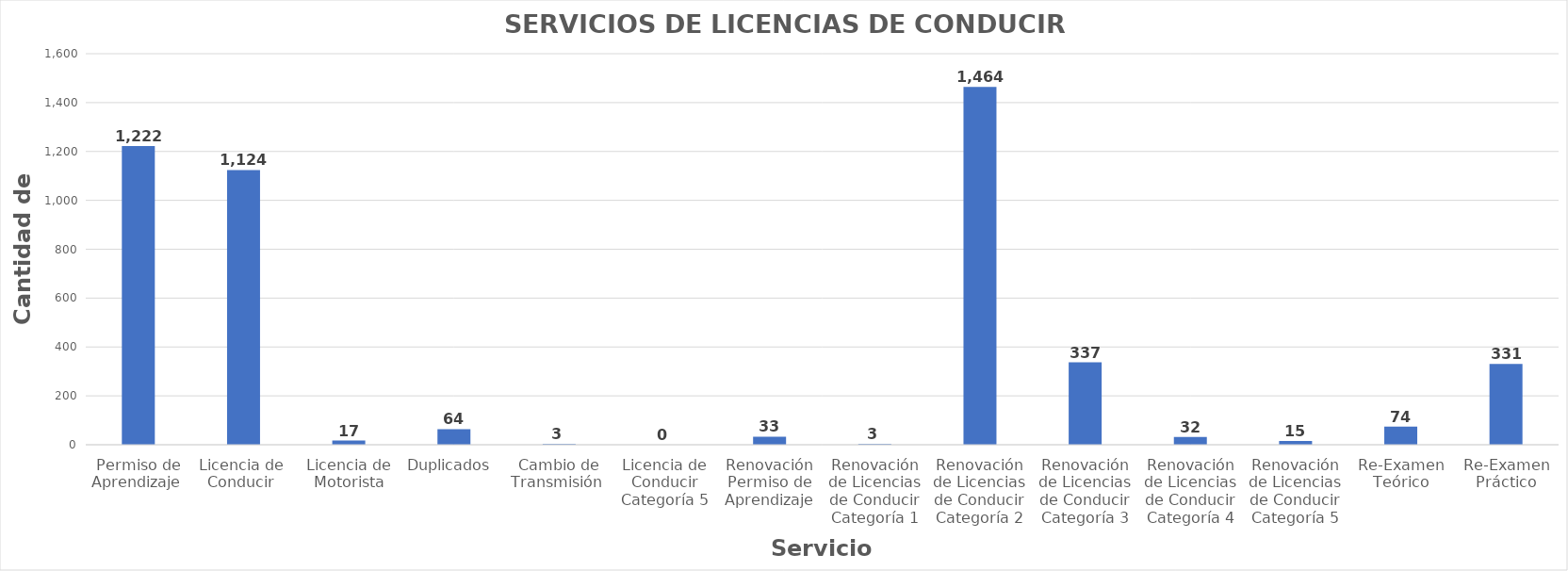
| Category | Series 0 |
|---|---|
| Permiso de Aprendizaje  | 1222 |
| Licencia de  Conducir  | 1124 |
| Licencia de Motorista | 17 |
| Duplicados  | 64 |
| Cambio de Transmisión  | 3 |
| Licencia de Conducir Categoría 5 | 0 |
| Renovación Permiso de Aprendizaje | 33 |
| Renovación de Licencias de Conducir Categoría 1 | 3 |
| Renovación de Licencias de Conducir Categoría 2 | 1464 |
| Renovación de Licencias de Conducir Categoría 3 | 337 |
| Renovación de Licencias de Conducir Categoría 4 | 32 |
| Renovación de Licencias de Conducir Categoría 5 | 15 |
| Re-Examen Teórico | 74 |
| Re-Examen Práctico | 331 |